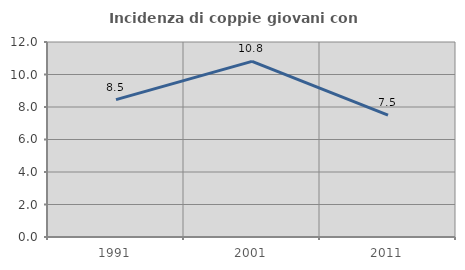
| Category | Incidenza di coppie giovani con figli |
|---|---|
| 1991.0 | 8.451 |
| 2001.0 | 10.811 |
| 2011.0 | 7.5 |